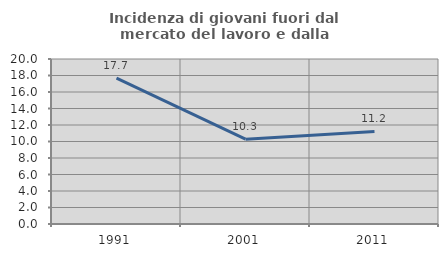
| Category | Incidenza di giovani fuori dal mercato del lavoro e dalla formazione  |
|---|---|
| 1991.0 | 17.692 |
| 2001.0 | 10.28 |
| 2011.0 | 11.215 |